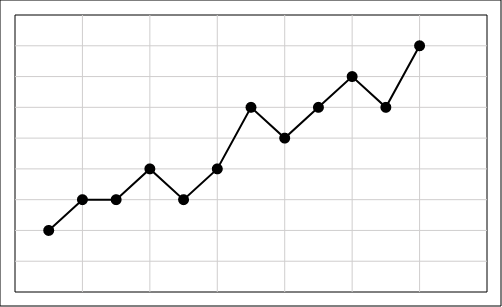
| Category | Sationary Time Series |
|---|---|
| 1.0 | 20 |
| 2.0 | 30 |
| 3.0 | 30 |
| 4.0 | 40 |
| 5.0 | 30 |
| 6.0 | 40 |
| 7.0 | 60 |
| 8.0 | 50 |
| 9.0 | 60 |
| 10.0 | 70 |
| 11.0 | 60 |
| 12.0 | 80 |